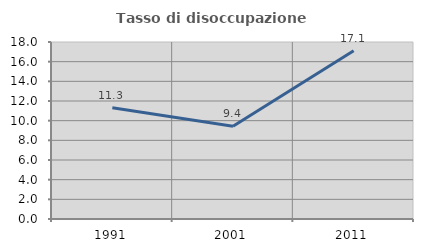
| Category | Tasso di disoccupazione giovanile  |
|---|---|
| 1991.0 | 11.307 |
| 2001.0 | 9.422 |
| 2011.0 | 17.12 |